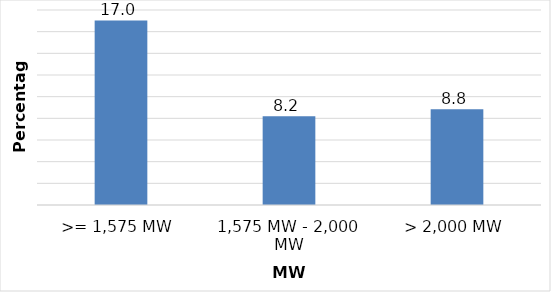
| Category | Series 0 |
|---|---|
| >= 1,575 MW | 17.035 |
| 1,575 MW - 2,000 MW | 8.2 |
| > 2,000 MW | 8.835 |